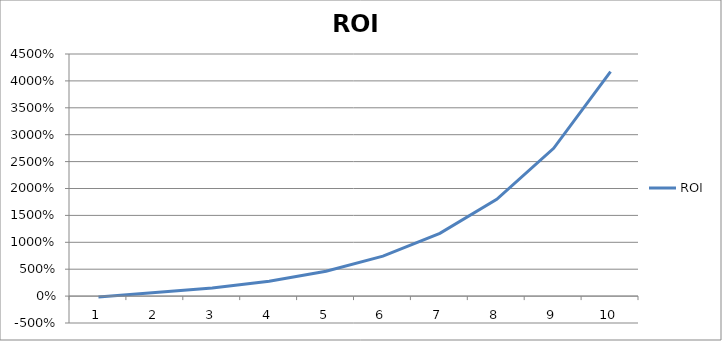
| Category | ROI |
|---|---|
| 0 | -0.167 |
| 1 | 0.667 |
| 2 | 1.5 |
| 3 | 2.75 |
| 4 | 4.625 |
| 5 | 7.438 |
| 6 | 11.656 |
| 7 | 17.984 |
| 8 | 27.477 |
| 9 | 41.715 |